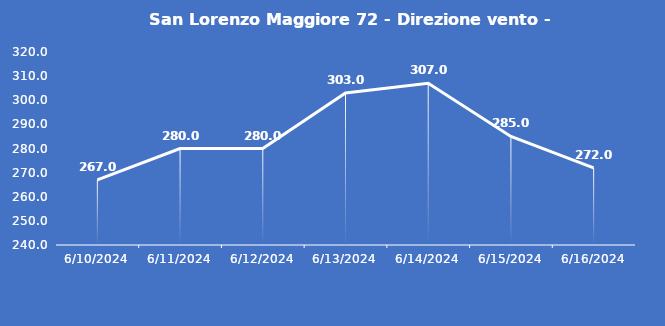
| Category | San Lorenzo Maggiore 72 - Direzione vento - Grezzo (°N) |
|---|---|
| 6/10/24 | 267 |
| 6/11/24 | 280 |
| 6/12/24 | 280 |
| 6/13/24 | 303 |
| 6/14/24 | 307 |
| 6/15/24 | 285 |
| 6/16/24 | 272 |